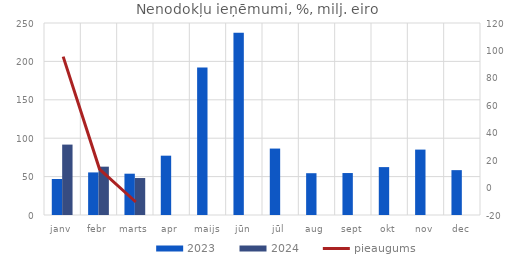
| Category | 2023 | 2024 |
|---|---|---|
| janv | 46.896 | 91.674 |
| febr | 55.445 | 62.936 |
| marts | 53.782 | 48.128 |
| apr | 77.237 | 0 |
| maijs | 192.092 | 0 |
| jūn | 237.322 | 0 |
| jūl | 86.507 | 0 |
| aug | 54.412 | 0 |
| sept | 54.638 | 0 |
| okt | 62.367 | 0 |
| nov | 85.157 | 0 |
| dec | 58.406 | 0 |